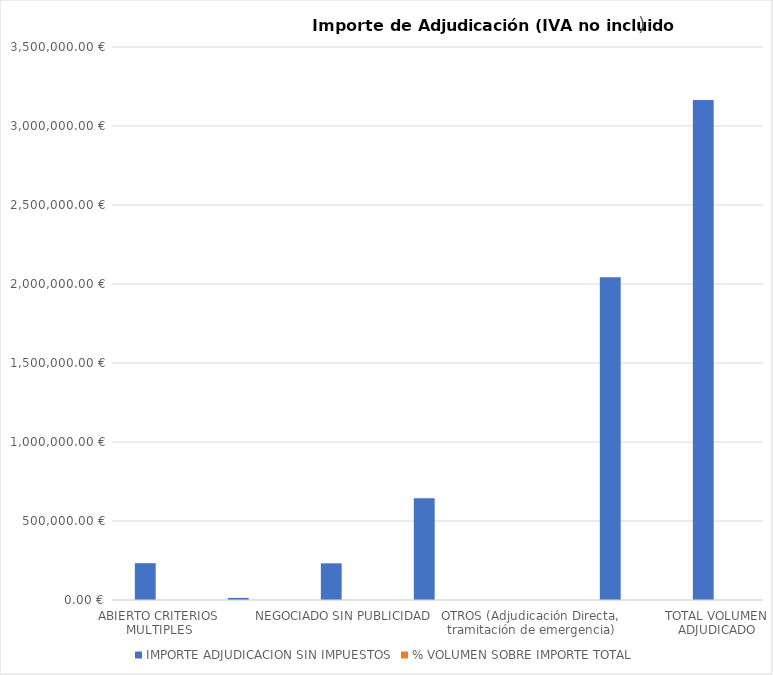
| Category | IMPORTE ADJUDICACION SIN IMPUESTOS | % VOLUMEN SOBRE IMPORTE TOTAL |
|---|---|---|
| ABIERTO CRITERIOS MULTIPLES | 232999.56 | 0.074 |
| ABIERTO SIMPLIFICADO SUMARIO | 13272.6 | 0.004 |
| NEGOCIADO SIN PUBLICIDAD | 232144.44 | 0.073 |
| Contratos Basados en Acuerdo Marco | 643876.78 | 0.204 |
| OTROS (Adjudicación Directa, tramitación de emergencia) | 0 | 0 |
| CONTRATOS MENORES * | 2042701.83 | 0.645 |
| TOTAL VOLUMEN ADJUDICADO | 3164995.21 | 1 |